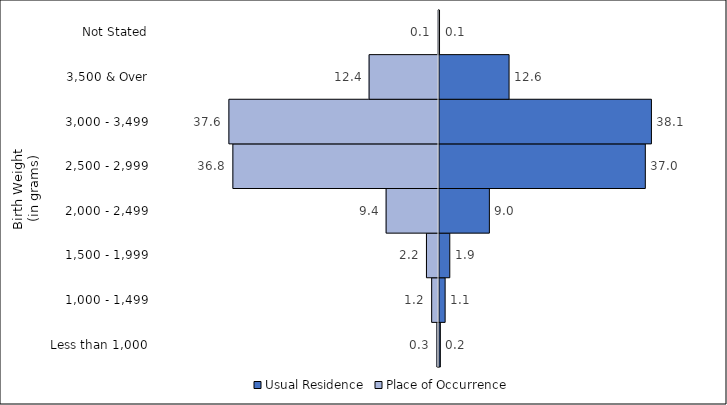
| Category | Usual Residence | Place of Occurrence |
|---|---|---|
| Less than 1,000 | 0.241 | -0.289 |
| 1,000 - 1,499 | 1.099 | -1.224 |
| 1,500 - 1,999 | 1.934 | -2.158 |
| 2,000 - 2,499 | 9.03 | -9.388 |
| 2,500 - 2,999 | 36.975 | -36.849 |
| 3,000 - 3,499 | 38.07 | -37.564 |
| 3,500 & Over | 12.558 | -12.436 |
| Not Stated | 0.094 | -0.092 |